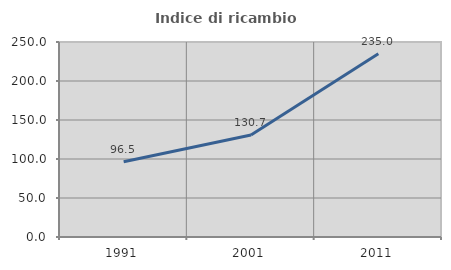
| Category | Indice di ricambio occupazionale  |
|---|---|
| 1991.0 | 96.458 |
| 2001.0 | 130.685 |
| 2011.0 | 234.985 |